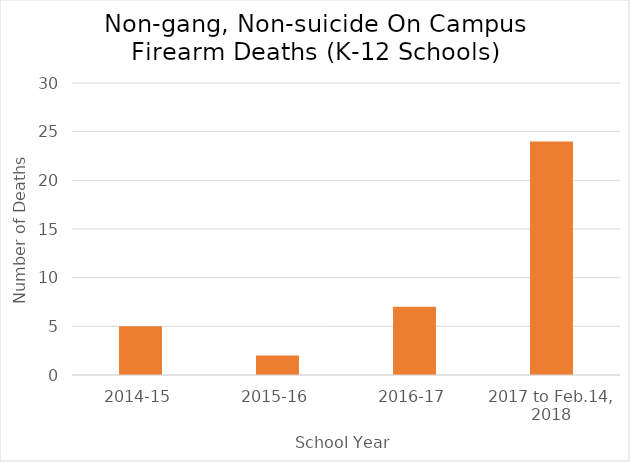
| Category | K12 |
|---|---|
| 2014-15 | 5 |
| 2015-16 | 2 |
| 2016-17 | 7 |
| 2017 to Feb.14, 2018 | 24 |